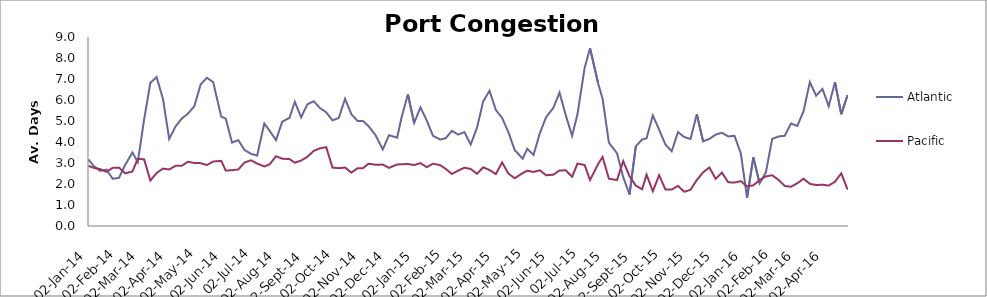
| Category | Atlantic  | Pacific |
|---|---|---|
| 2014-01-02 | 3.167 | 2.863 |
| 2014-01-08 | 2.854 | 2.767 |
| 2014-01-15 | 2.625 | 2.712 |
| 2014-01-22 | 2.688 | 2.582 |
| 2014-01-29 | 2.25 | 2.767 |
| 2014-02-05 | 2.292 | 2.781 |
| 2014-02-12 | 2.917 | 2.507 |
| 2014-02-20 | 3.5 | 2.596 |
| 2014-02-26 | 3.042 | 3.199 |
| 2014-03-05 | 5.059 | 3.178 |
| 2014-03-12 | 6.824 | 2.164 |
| 2014-03-19 | 7.088 | 2.527 |
| 2014-03-26 | 6.059 | 2.733 |
| 2014-04-02 | 4.147 | 2.692 |
| 2014-04-09 | 4.735 | 2.863 |
| 2014-04-16 | 5.118 | 2.87 |
| 2014-04-23 | 5.353 | 3.062 |
| 2014-04-30 | 5.706 | 3 |
| 2014-05-07 | 6.735 | 2.993 |
| 2014-05-14 | 7.059 | 2.904 |
| 2014-05-21 | 6.853 | 3.068 |
| 2014-05-30 | 5.206 | 3.103 |
| 2014-06-04 | 5.118 | 2.637 |
| 2014-06-11 | 3.971 | 2.658 |
| 2014-06-18 | 4.088 | 2.692 |
| 2014-06-25 | 3.618 | 3.021 |
| 2014-07-02 | 3.441 | 3.13 |
| 2014-07-09 | 3.353 | 2.973 |
| 2014-07-17 | 4.882 | 2.836 |
| 2014-07-23 | 4.529 | 2.938 |
| 2014-07-30 | 4.088 | 3.322 |
| 2014-08-06 | 4.971 | 3.205 |
| 2014-08-14 | 5.147 | 3.185 |
| 2014-08-20 | 5.912 | 3.014 |
| 2014-08-27 | 5.176 | 3.116 |
| 2014-09-03 | 5.794 | 3.295 |
| 2014-09-10 | 5.941 | 3.575 |
| 2014-09-17 | 5.618 | 3.699 |
| 2014-09-24 | 5.412 | 3.753 |
| 2014-10-01 | 5.029 | 2.781 |
| 2014-10-08 | 5.147 | 2.753 |
| 2014-10-15 | 6.059 | 2.785 |
| 2014-10-22 | 5.324 | 2.541 |
| 2014-10-29 | 5 | 2.753 |
| 2014-11-04 | 5 | 2.753 |
| 2014-11-10 | 4.765 | 2.966 |
| 2014-11-18 | 4.324 | 2.918 |
| 2014-11-26 | 3.647 | 2.925 |
| 2014-12-03 | 4.324 | 2.767 |
| 2014-12-12 | 4.206 | 2.932 |
| 2014-12-17 | 5.176 | 2.938 |
| 2014-12-24 | 6.265 | 2.952 |
| 2014-12-31 | 4.912 | 2.904 |
| 2015-01-07 | 5.647 | 2.993 |
| 2015-01-14 | 5.029 | 2.801 |
| 2015-01-21 | 4.294 | 2.966 |
| 2015-01-29 | 4.118 | 2.897 |
| 2015-02-04 | 4.176 | 2.726 |
| 2015-02-11 | 4.529 | 2.479 |
| 2015-02-18 | 4.353 | 2.637 |
| 2015-02-25 | 4.471 | 2.774 |
| 2015-03-04 | 3.882 | 2.719 |
| 2015-03-11 | 4.676 | 2.486 |
| 2015-03-18 | 5.941 | 2.795 |
| 2015-03-25 | 6.441 | 2.664 |
| 2015-04-01 | 5.529 | 2.473 |
| 2015-04-08 | 5.147 | 3.027 |
| 2015-04-15 | 4.471 | 2.5 |
| 2015-04-22 | 3.618 | 2.274 |
| 2015-05-01 | 3.206 | 2.521 |
| 2015-05-06 | 3.676 | 2.63 |
| 2015-05-13 | 3.382 | 2.575 |
| 2015-05-20 | 4.412 | 2.651 |
| 2015-05-27 | 5.176 | 2.418 |
| 2015-06-04 | 5.618 | 2.442 |
| 2015-06-11 | 6.353 | 2.645 |
| 2015-06-18 | 5.265 | 2.651 |
| 2015-06-25 | 4.294 | 2.342 |
| 2015-07-01 | 5.324 | 2.973 |
| 2015-07-09 | 7.529 | 2.904 |
| 2015-07-15 | 8.471 | 2.189 |
| 2015-07-24 | 6.794 | 2.952 |
| 2015-07-29 | 6.059 | 3.288 |
| 2015-08-05 | 3.971 | 2.253 |
| 2015-08-14 | 3.471 | 2.185 |
| 2015-08-21 | 2.324 | 3.089 |
| 2015-08-28 | 1.5 | 2.37 |
| 2015-09-04 | 3.794 | 1.925 |
| 2015-09-11 | 4.118 | 1.747 |
| 2015-09-16 | 4.176 | 2.445 |
| 2015-09-23 | 5.265 | 1.658 |
| 2015-09-30 | 4.588 | 2.418 |
| 2015-10-07 | 3.882 | 1.74 |
| 2015-10-14 | 3.559 | 1.733 |
| 2015-10-21 | 4.471 | 1.911 |
| 2015-10-28 | 4.235 | 1.63 |
| 2015-11-04 | 4.147 | 1.726 |
| 2015-11-11 | 5.324 | 2.192 |
| 2015-11-18 | 4.029 | 2.555 |
| 2015-11-25 | 4.147 | 2.788 |
| 2015-12-02 | 4.353 | 2.247 |
| 2015-12-09 | 4.441 | 2.541 |
| 2015-12-16 | 4.265 | 2.082 |
| 2015-12-23 | 4.294 | 2.068 |
| 2015-12-30 | 3.471 | 2.137 |
| 2016-01-06 | 1.353 | 1.884 |
| 2016-01-13 | 3.265 | 1.938 |
| 2016-01-20 | 2.029 | 2.185 |
| 2016-01-27 | 2.559 | 2.363 |
| 2016-02-03 | 4.147 | 2.418 |
| 2016-02-10 | 4.265 | 2.199 |
| 2016-02-17 | 4.294 | 1.904 |
| 2016-02-24 | 4.882 | 1.87 |
| 2016-03-02 | 4.765 | 2.034 |
| 2016-03-09 | 5.471 | 2.253 |
| 2016-03-16 | 6.853 | 2.007 |
| 2016-03-23 | 6.206 | 1.952 |
| 2016-03-30 | 6.529 | 1.966 |
| 2016-04-06 | 5.706 | 1.925 |
| 2016-04-13 | 6.853 | 2.11 |
| 2016-04-20 | 5.324 | 2.507 |
| 2016-04-27 | 6.235 | 1.733 |